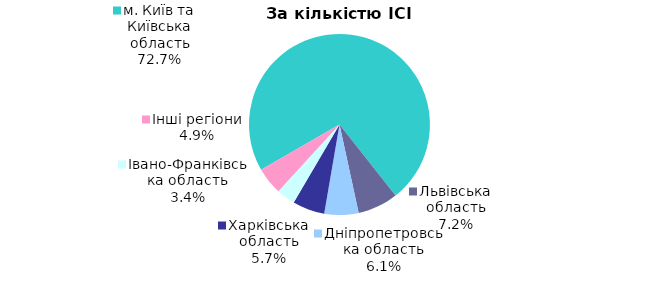
| Category | Series 0 |
|---|---|
| м. Київ та Київська область | 0.727 |
| Львівська область | 0.072 |
| Дніпропетровська область | 0.061 |
| Харківська область | 0.057 |
| Iвано-Франкiвська область | 0.034 |
| Інші регіони | 0.049 |